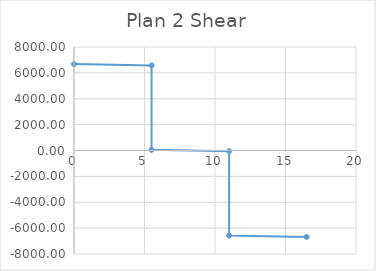
| Category | Plan 2 Shear |
|---|---|
| 0.0 | 6676.385 |
| 5.5 | 6576.434 |
| 5.5 | 49.976 |
| 11.0 | -49.976 |
| 11.0 | -6576.434 |
| 16.5 | -6676.385 |